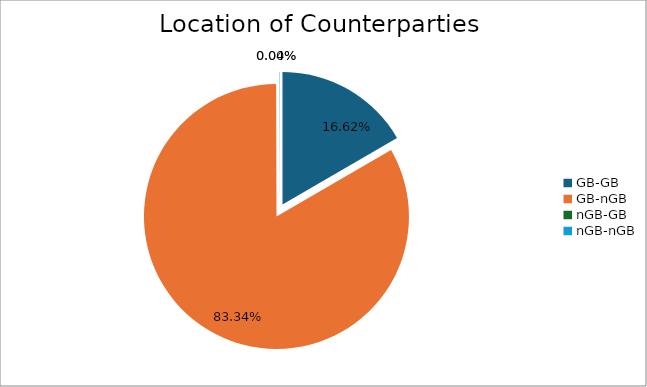
| Category | Series 0 |
|---|---|
| GB-GB | 1782319.1 |
| GB-nGB | 8939192.649 |
| nGB-GB | 0 |
| nGB-nGB | 4823.443 |